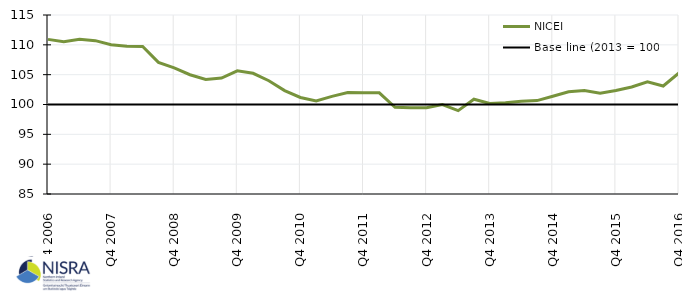
| Category | NICEI | Base line (2013 = 100) |
|---|---|---|
| Q4 2006 | 110.914 | 100 |
|  | 110.529 | 100 |
|  | 110.945 | 100 |
|  | 110.703 | 100 |
| Q4 2007 | 110.02 | 100 |
|  | 109.762 | 100 |
|  | 109.713 | 100 |
|  | 107.059 | 100 |
| Q4 2008 | 106.127 | 100 |
|  | 104.988 | 100 |
|  | 104.193 | 100 |
|  | 104.433 | 100 |
| Q4 2009 | 105.634 | 100 |
|  | 105.225 | 100 |
|  | 103.983 | 100 |
|  | 102.331 | 100 |
| Q4 2010 | 101.18 | 100 |
|  | 100.577 | 100 |
|  | 101.365 | 100 |
|  | 101.992 | 100 |
| Q4 2011 | 101.989 | 100 |
|  | 101.96 | 100 |
|  | 99.519 | 100 |
|  | 99.451 | 100 |
| Q4 2012 | 99.445 | 100 |
|  | 99.977 | 100 |
|  | 98.972 | 100 |
|  | 100.881 | 100 |
| Q4 2013 | 100.171 | 100 |
|  | 100.287 | 100 |
|  | 100.56 | 100 |
|  | 100.65 | 100 |
| Q4 2014 | 101.383 | 100 |
|  | 102.142 | 100 |
|  | 102.325 | 100 |
|  | 101.885 | 100 |
| Q4 2015 | 102.352 | 100 |
|  | 102.943 | 100 |
|  | 103.793 | 100 |
|  | 103.102 | 100 |
| Q4 2016 | 105.298 | 100 |